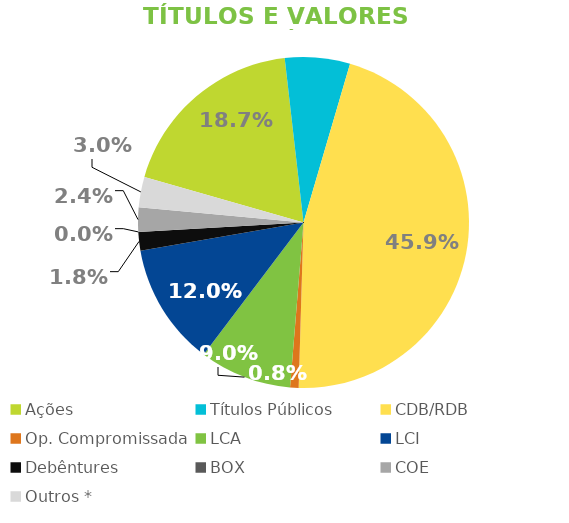
| Category | TVM |
|---|---|
| Ações | 0.187 |
| Títulos Públicos | 0.064 |
| CDB/RDB | 0.459 |
| Op. Compromissada | 0.008 |
| LCA | 0.09 |
| LCI | 0.12 |
| Debêntures | 0.018 |
| BOX | 0 |
| COE | 0.024 |
| Outros * | 0.03 |